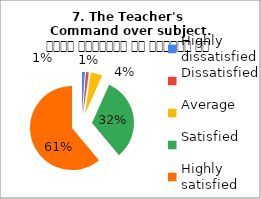
| Category | 7. The Teacher's 
Command over subject. विषय अवधारणा पर शिक्षक का ज्ञान |
|---|---|
| Highly dissatisfied | 1 |
| Dissatisfied | 1 |
| Average | 4 |
| Satisfied | 29 |
| Highly satisfied | 55 |